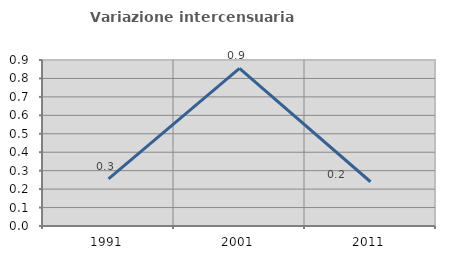
| Category | Variazione intercensuaria annua |
|---|---|
| 1991.0 | 0.256 |
| 2001.0 | 0.855 |
| 2011.0 | 0.24 |